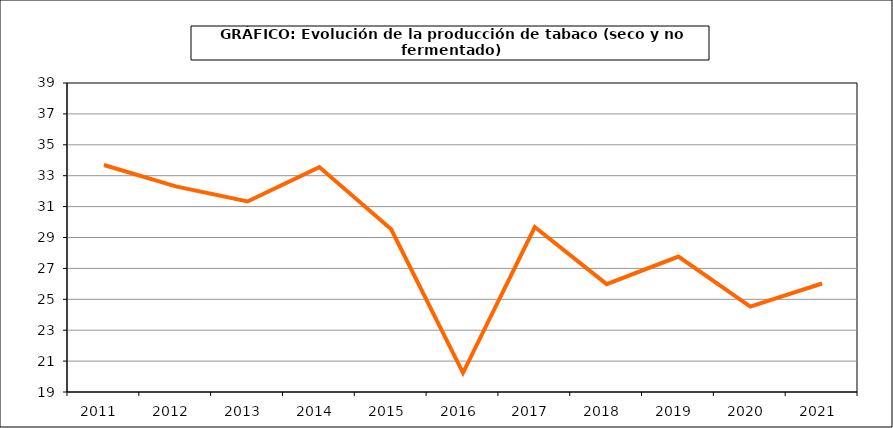
| Category | Producción |
|---|---|
| 2011.0 | 33.692 |
| 2012.0 | 32.308 |
| 2013.0 | 31.333 |
| 2014.0 | 33.557 |
| 2015.0 | 29.534 |
| 2016.0 | 20.238 |
| 2017.0 | 29.679 |
| 2018.0 | 25.983 |
| 2019.0 | 27.766 |
| 2020.0 | 24.532 |
| 2021.0 | 26.022 |